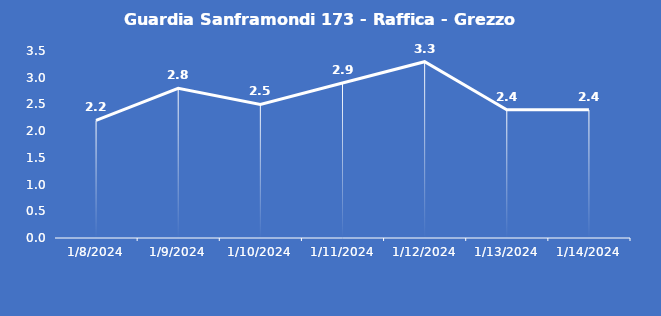
| Category | Guardia Sanframondi 173 - Raffica - Grezzo (m/s) |
|---|---|
| 1/8/24 | 2.2 |
| 1/9/24 | 2.8 |
| 1/10/24 | 2.5 |
| 1/11/24 | 2.9 |
| 1/12/24 | 3.3 |
| 1/13/24 | 2.4 |
| 1/14/24 | 2.4 |